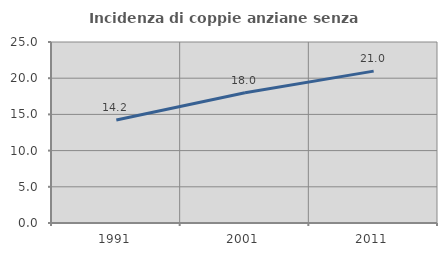
| Category | Incidenza di coppie anziane senza figli  |
|---|---|
| 1991.0 | 14.222 |
| 2001.0 | 17.979 |
| 2011.0 | 20.977 |